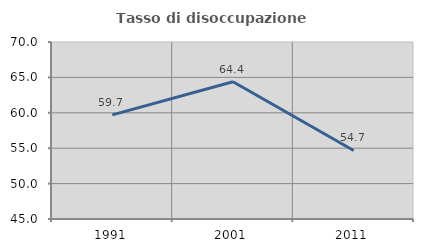
| Category | Tasso di disoccupazione giovanile  |
|---|---|
| 1991.0 | 59.701 |
| 2001.0 | 64.39 |
| 2011.0 | 54.68 |